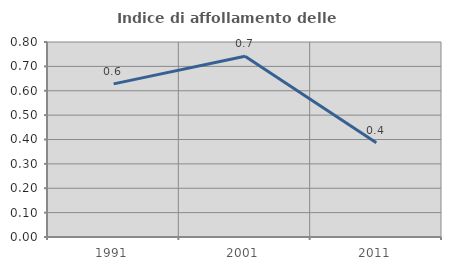
| Category | Indice di affollamento delle abitazioni  |
|---|---|
| 1991.0 | 0.628 |
| 2001.0 | 0.741 |
| 2011.0 | 0.386 |